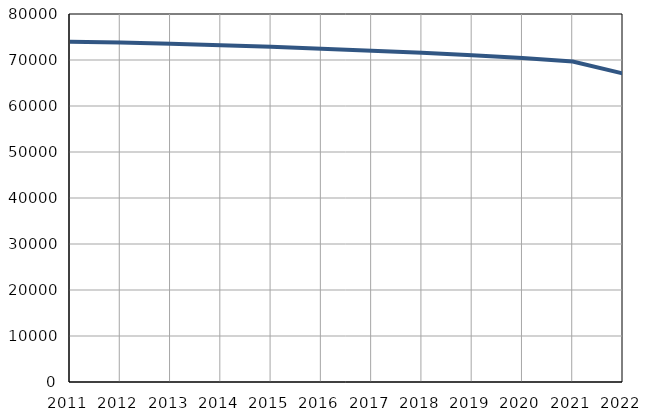
| Category | Број
становника |
|---|---|
| 2011.0 | 73977 |
| 2012.0 | 73789 |
| 2013.0 | 73512 |
| 2014.0 | 73200 |
| 2015.0 | 72856 |
| 2016.0 | 72443 |
| 2017.0 | 72020 |
| 2018.0 | 71551 |
| 2019.0 | 71050 |
| 2020.0 | 70460 |
| 2021.0 | 69654 |
| 2022.0 | 67054 |